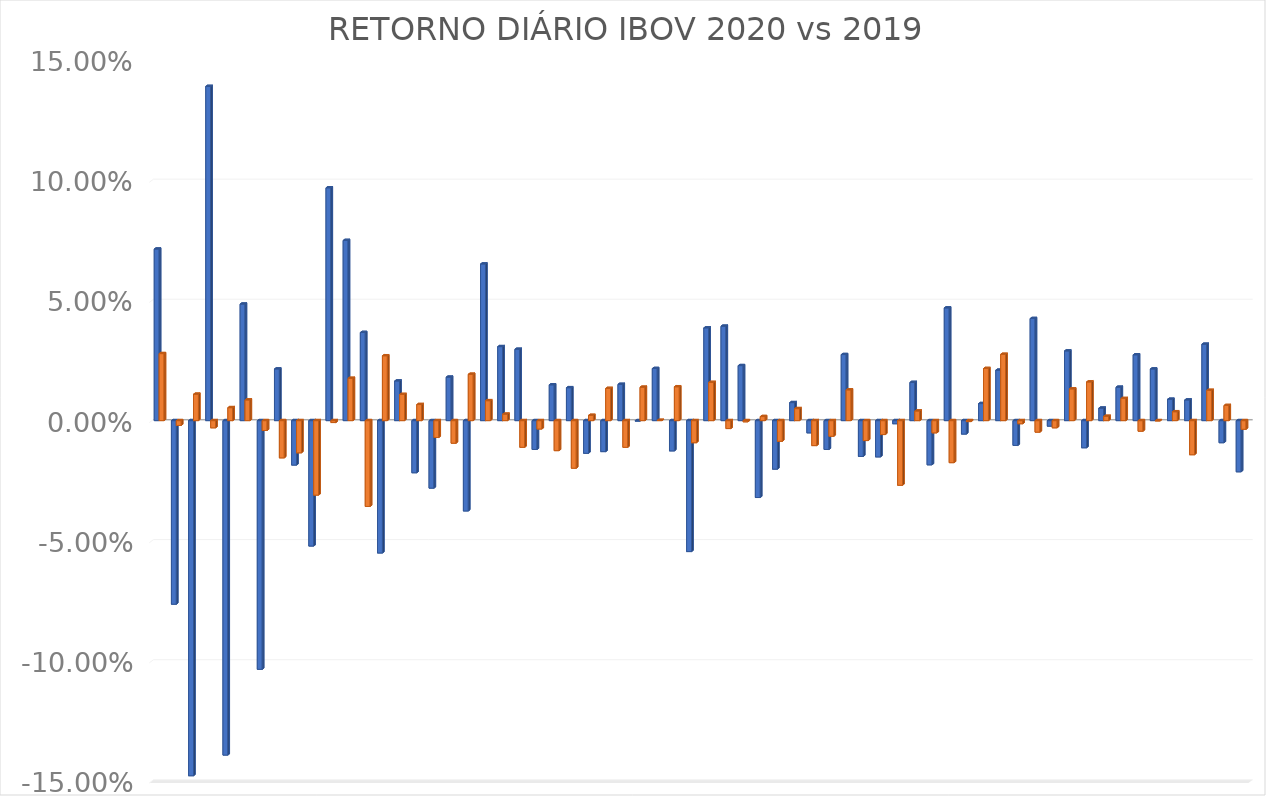
| Category | Series 0 | Series 1 |
|---|---|---|
| 0 | 0.071 | 0.028 |
| 1 | -0.076 | -0.002 |
| 2 | -0.148 | 0.011 |
| 3 | 0.139 | -0.003 |
| 4 | -0.139 | 0.005 |
| 5 | 0.048 | 0.009 |
| 6 | -0.104 | -0.004 |
| 7 | 0.022 | -0.016 |
| 8 | -0.019 | -0.013 |
| 9 | -0.052 | -0.031 |
| 10 | 0.097 | -0.001 |
| 11 | 0.075 | 0.018 |
| 12 | 0.037 | -0.036 |
| 13 | -0.055 | 0.027 |
| 14 | 0.016 | 0.011 |
| 15 | -0.022 | 0.007 |
| 16 | -0.028 | -0.007 |
| 17 | 0.018 | -0.009 |
| 18 | -0.038 | 0.019 |
| 19 | 0.065 | 0.008 |
| 20 | 0.031 | 0.003 |
| 21 | 0.03 | -0.011 |
| 22 | -0.012 | -0.003 |
| 23 | 0.015 | -0.012 |
| 24 | 0.014 | -0.02 |
| 25 | -0.014 | 0.002 |
| 26 | -0.013 | 0.013 |
| 27 | 0.015 | -0.011 |
| 28 | 0 | 0.014 |
| 29 | 0.022 | 0 |
| 30 | -0.013 | 0.014 |
| 31 | -0.054 | -0.009 |
| 32 | 0.039 | 0.016 |
| 33 | 0.039 | -0.003 |
| 34 | 0.023 | 0 |
| 35 | -0.032 | 0.002 |
| 36 | -0.02 | -0.009 |
| 37 | 0.008 | 0.005 |
| 38 | -0.005 | -0.01 |
| 39 | -0.012 | -0.007 |
| 40 | 0.028 | 0.013 |
| 41 | -0.015 | -0.008 |
| 42 | -0.015 | -0.006 |
| 43 | -0.001 | -0.027 |
| 44 | 0.016 | 0.004 |
| 45 | -0.018 | -0.005 |
| 46 | 0.047 | -0.018 |
| 47 | -0.006 | 0 |
| 48 | 0.007 | 0.022 |
| 49 | 0.021 | 0.028 |
| 50 | -0.01 | -0.001 |
| 51 | 0.042 | -0.005 |
| 52 | -0.002 | -0.003 |
| 53 | 0.029 | 0.013 |
| 54 | -0.011 | 0.016 |
| 55 | 0.005 | 0.002 |
| 56 | 0.014 | 0.009 |
| 57 | 0.027 | -0.004 |
| 58 | 0.022 | 0 |
| 59 | 0.009 | 0.004 |
| 60 | 0.009 | -0.014 |
| 61 | 0.032 | 0.013 |
| 62 | -0.009 | 0.006 |
| 63 | -0.021 | -0.004 |